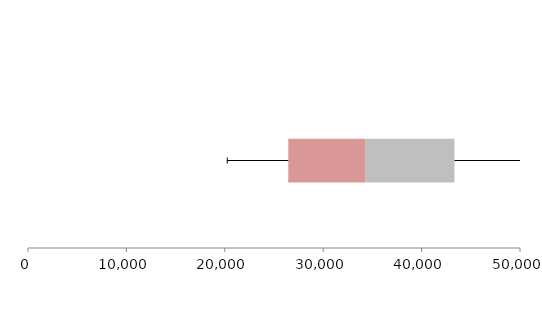
| Category | Series 1 | Series 2 | Series 3 |
|---|---|---|---|
| 0 | 26454.182 | 7803.188 | 9081.443 |